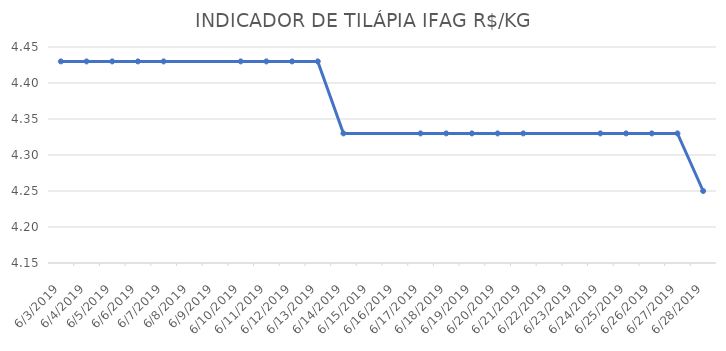
| Category | INDICADOR DE TILÁPIA IFAG |
|---|---|
| 6/3/19 | 4.43 |
| 6/4/19 | 4.43 |
| 6/5/19 | 4.43 |
| 6/6/19 | 4.43 |
| 6/7/19 | 4.43 |
| 6/10/19 | 4.43 |
| 6/11/19 | 4.43 |
| 6/12/19 | 4.43 |
| 6/13/19 | 4.43 |
| 6/14/19 | 4.33 |
| 6/17/19 | 4.33 |
| 6/18/19 | 4.33 |
| 6/19/19 | 4.33 |
| 6/20/19 | 4.33 |
| 6/21/19 | 4.33 |
| 6/24/19 | 4.33 |
| 6/25/19 | 4.33 |
| 6/26/19 | 4.33 |
| 6/27/19 | 4.33 |
| 6/28/19 | 4.25 |